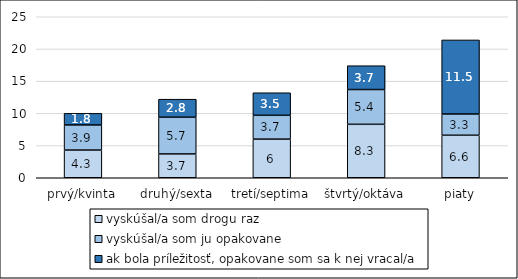
| Category | vyskúšal/a som drogu raz | vyskúšal/a som ju opakovane | ak bola príležitosť, opakovane som sa k nej vracal/a |
|---|---|---|---|
| prvý/kvinta | 4.3 | 3.9 | 1.8 |
| druhý/sexta | 3.7 | 5.7 | 2.8 |
| tretí/septima | 6 | 3.7 | 3.5 |
| štvrtý/oktáva | 8.3 | 5.4 | 3.7 |
| piaty | 6.6 | 3.3 | 11.5 |